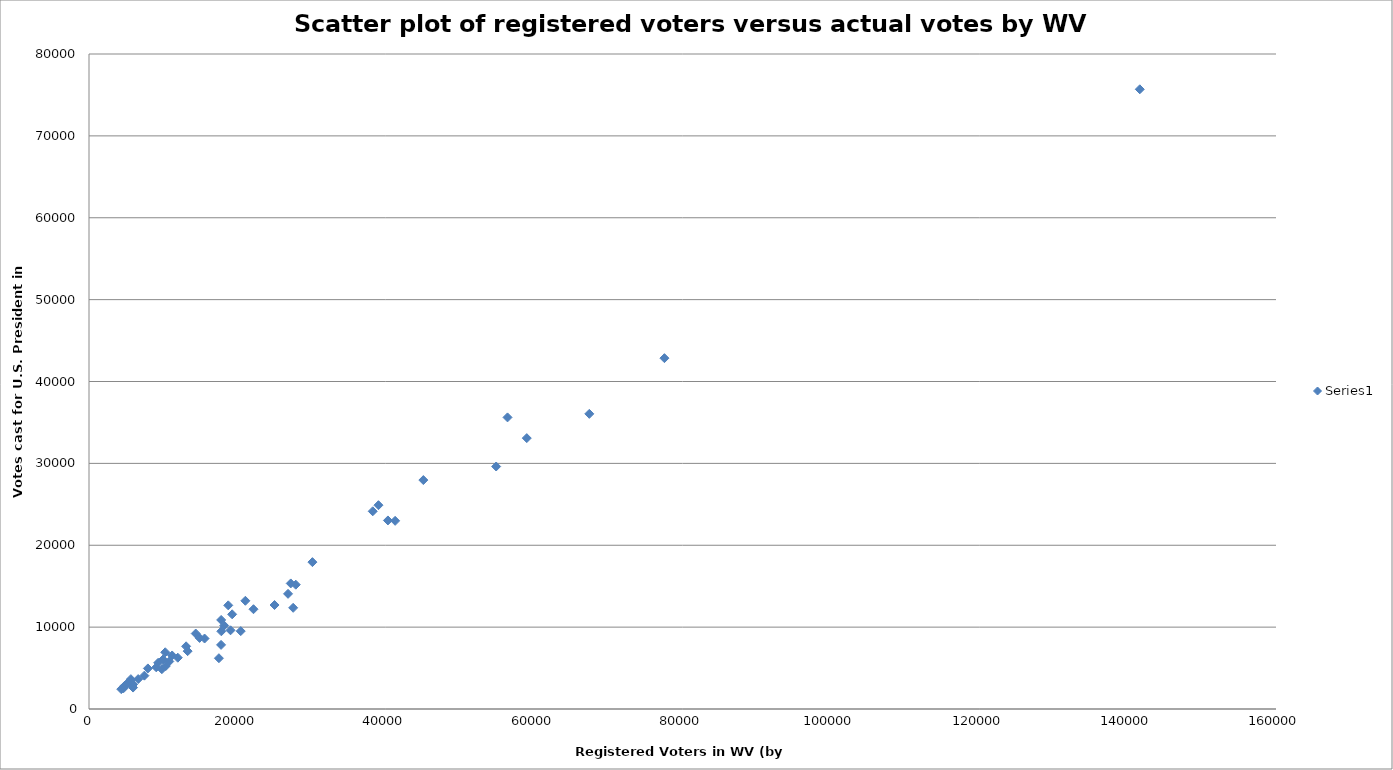
| Category | Series 0 |
|---|---|
| 9984.0 | 6054 |
| 77563.0 | 42850 |
| 14908.0 | 8683 |
| 9067.0 | 5090 |
| 19079.0 | 9613 |
| 59010.0 | 33085 |
| 5939.0 | 2617 |
| 5891.0 | 2972 |
| 4811.0 | 2840 |
| 27196.0 | 15337 |
| 4661.0 | 2543 |
| 7937.0 | 4956 |
| 26831.0 | 14066 |
| 15578.0 | 8608 |
| 25010.0 | 12702 |
| 9324.0 | 5643 |
| 45067.0 | 27960 |
| 22173.0 | 12187 |
| 38245.0 | 24147 |
| 141639.0 | 75690 |
| 10278.0 | 6928 |
| 13295.0 | 7066 |
| 27523.0 | 12359 |
| 40293.0 | 23029 |
| 21078.0 | 13216 |
| 18225.0 | 10186 |
| 17511.0 | 6203 |
| 41266.0 | 22982 |
| 19297.0 | 11564 |
| 20452.0 | 9510 |
| 67438.0 | 36048 |
| 10818.0 | 5805 |
| 13088.0 | 7654 |
| 17838.0 | 9491 |
| 30114.0 | 17938 |
| 5316.0 | 3225 |
| 5205.0 | 3150 |
| 5644.0 | 3646 |
| 18772.0 | 12659 |
| 39015.0 | 24893 |
| 54884.0 | 29618 |
| 17817.0 | 10876 |
| 7465.0 | 4075 |
| 10349.0 | 5247 |
| 9817.0 | 4862 |
| 11208.0 | 6538 |
| 5626.0 | 3475 |
| 6628.0 | 3654 |
| 14386.0 | 9218 |
| 27872.0 | 15182 |
| 5917.0 | 2978 |
| 11968.0 | 6265 |
| 4351.0 | 2422 |
| 56415.0 | 35615 |
| 17805.0 | 7831 |